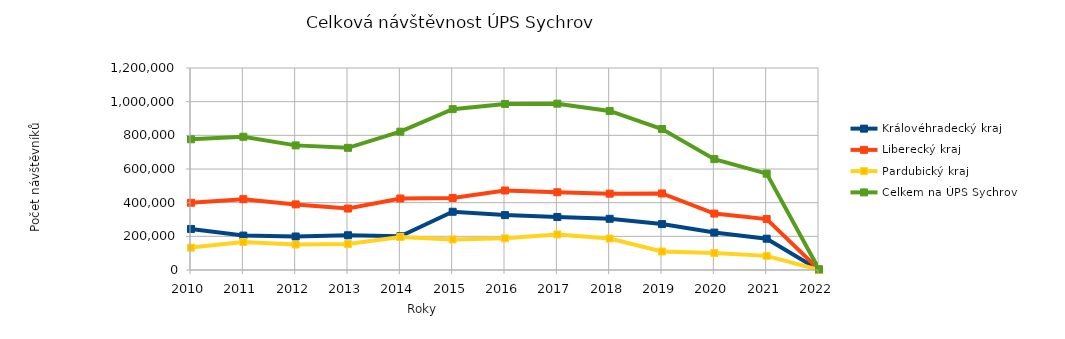
| Category | Královéhradecký kraj | Liberecký kraj | Pardubický kraj | Celkem na ÚPS Sychrov |
|---|---|---|---|---|
| 2010.0 | 243910 | 399672 | 133004 | 776586 |
| 2011.0 | 204481 | 420780 | 166238 | 791499 |
| 2012.0 | 199025 | 389781 | 151509 | 740315 |
| 2013.0 | 206419 | 365108 | 154165 | 725692 |
| 2014.0 | 200438 | 424718 | 196473 | 821629 |
| 2015.0 | 345970 | 428023 | 181567 | 955560 |
| 2016.0 | 326137 | 472318 | 188108 | 986563 |
| 2017.0 | 314983 | 461803 | 211268 | 988054 |
| 2018.0 | 304267 | 453568 | 187017 | 944852 |
| 2019.0 | 272720 | 454785 | 109949 | 837454 |
| 2020.0 | 222238 | 335261 | 101211 | 658710 |
| 2021.0 | 185934 | 302574 | 83925 | 572433 |
| 2022.0 | 363 | 2860 | 1038 | 4261 |